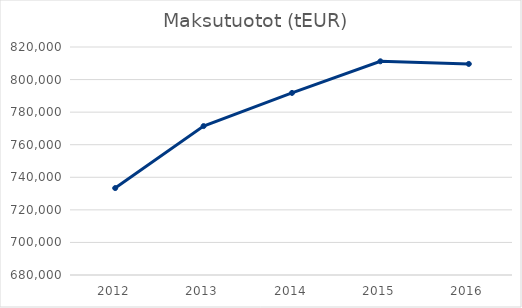
| Category | Maksutuotot  |
|---|---|
| 2012.0 | 733380.051 |
| 2013.0 | 771440.302 |
| 2014.0 | 791804.232 |
| 2015.0 | 811218.854 |
| 2016.0 | 809603.44 |